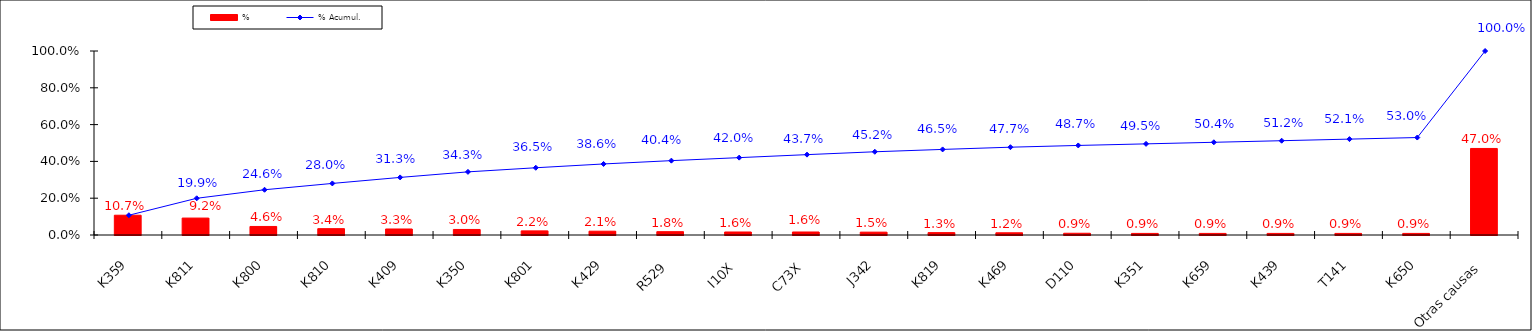
| Category | % |
|---|---|
| K359 | 0.107 |
| K811 | 0.092 |
| K800 | 0.046 |
| K810 | 0.034 |
| K409 | 0.033 |
| K350 | 0.03 |
| K801 | 0.022 |
| K429 | 0.021 |
| R529 | 0.018 |
| I10X | 0.016 |
| C73X | 0.016 |
| J342 | 0.015 |
| K819 | 0.013 |
| K469 | 0.012 |
| D110 | 0.009 |
| K351 | 0.009 |
| K659 | 0.009 |
| K439 | 0.009 |
| T141 | 0.009 |
| K650 | 0.009 |
| Otras causas | 0.47 |